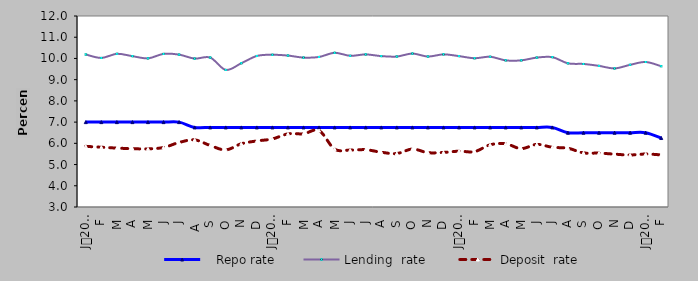
| Category |    Repo rate | Lending  rate | Deposit  rate |
|---|---|---|---|
| 0 | 7 | 10.187 | 5.858 |
| 1900-01-01 | 7 | 10.024 | 5.815 |
| 1900-01-02 | 7 | 10.218 | 5.776 |
| 1900-01-03 | 7 | 10.107 | 5.746 |
| 1900-01-04 | 7 | 10.004 | 5.74 |
| 1900-01-05 | 7 | 10.214 | 5.804 |
| 1900-01-06 | 7 | 10.18 | 6.04 |
| 1900-01-07 | 6.75 | 9.994 | 6.162 |
| 1900-01-08 | 6.75 | 10.042 | 5.898 |
| 1900-01-09 | 6.75 | 9.46 | 5.69 |
| 1900-01-10 | 6.75 | 9.774 | 5.98 |
| 1900-01-11 | 6.75 | 10.117 | 6.113 |
| 1900-01-12 | 6.75 | 10.174 | 6.207 |
| 1900-01-13 | 6.75 | 10.136 | 6.446 |
| 1900-01-14 | 6.75 | 10.04 | 6.45 |
| 1900-01-15 | 6.75 | 10.07 | 6.6 |
| 1900-01-16 | 6.75 | 10.265 | 5.728 |
| 1900-01-17 | 6.75 | 10.125 | 5.682 |
| 1900-01-18 | 6.75 | 10.19 | 5.7 |
| 1900-01-19 | 6.75 | 10.11 | 5.58 |
| 1900-01-20 | 6.75 | 10.09 | 5.52 |
| 1900-01-21 | 6.75 | 10.23 | 5.73 |
| 1900-01-22 | 6.75 | 10.09 | 5.56 |
| 1900-01-23 | 6.75 | 10.192 | 5.572 |
| 1900-01-24 | 6.75 | 10.11 | 5.63 |
| 1900-01-25 | 6.75 | 10.01 | 5.61 |
| 1900-01-26 | 6.75 | 10.08 | 5.93 |
| 1900-01-27 | 6.75 | 9.91 | 5.98 |
| 1900-01-28 | 6.75 | 9.91 | 5.75 |
| 1900-01-29 | 6.75 | 10.04 | 5.95 |
| 1900-01-30 | 6.75 | 10.06 | 5.813 |
| 1900-01-31 | 6.5 | 9.77 | 5.77 |
| 1900-02-01 | 6.5 | 9.74 | 5.55 |
| 1900-02-02 | 6.5 | 9.65 | 5.54 |
| 1900-02-03 | 6.5 | 9.53 | 5.49 |
| 1900-02-04 | 6.5 | 9.7 | 5.45 |
| 1900-02-05 | 6.5 | 9.833 | 5.497 |
| 1900-02-06 | 6.25 | 9.634 | 5.454 |